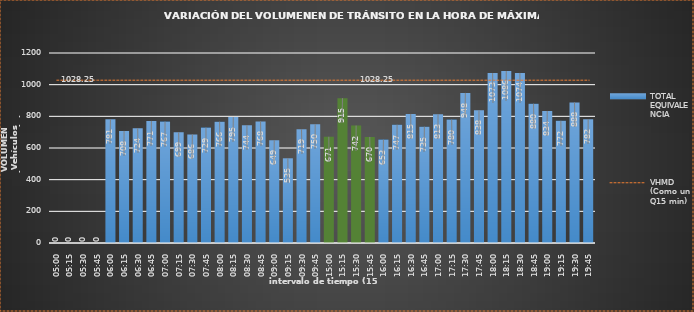
| Category | TOTAL EQUIVALENCIA   |
|---|---|
| 500.0 | 0 |
| 515.0 | 0 |
| 530.0 | 0 |
| 545.0 | 0 |
| 600.0 | 781 |
| 615.0 | 708 |
| 630.0 | 724 |
| 645.0 | 771 |
| 700.0 | 767 |
| 715.0 | 699 |
| 730.0 | 686 |
| 745.0 | 729 |
| 800.0 | 766 |
| 815.0 | 795 |
| 830.0 | 744 |
| 845.0 | 768 |
| 900.0 | 649 |
| 915.0 | 535 |
| 930.0 | 719 |
| 945.0 | 750 |
| 1500.0 | 671 |
| 1515.0 | 915 |
| 1530.0 | 742 |
| 1545.0 | 670 |
| 1600.0 | 653 |
| 1615.0 | 747 |
| 1630.0 | 815 |
| 1645.0 | 735 |
| 1700.0 | 813 |
| 1715.0 | 780 |
| 1730.0 | 948 |
| 1745.0 | 838 |
| 1800.0 | 1073 |
| 1815.0 | 1086 |
| 1830.0 | 1074 |
| 1845.0 | 880 |
| 1900.0 | 834 |
| 1915.0 | 772 |
| 1930.0 | 888 |
| 1945.0 | 782 |